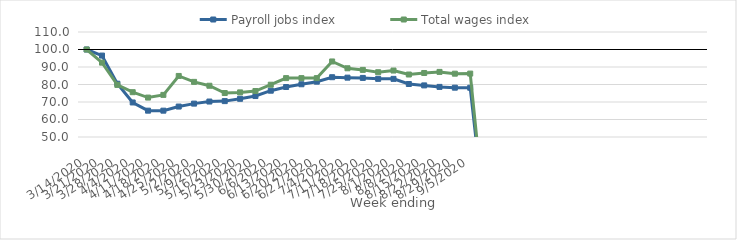
| Category | Payroll jobs index | Total wages index |
|---|---|---|
| 14/03/2020 | 100 | 100 |
| 21/03/2020 | 96.53 | 92.487 |
| 28/03/2020 | 80.452 | 79.766 |
| 04/04/2020 | 69.733 | 75.614 |
| 11/04/2020 | 65.047 | 72.531 |
| 18/04/2020 | 65.046 | 74.069 |
| 25/04/2020 | 67.4 | 84.884 |
| 02/05/2020 | 69.078 | 81.508 |
| 09/05/2020 | 70.267 | 79.287 |
| 16/05/2020 | 70.504 | 75.132 |
| 23/05/2020 | 71.823 | 75.489 |
| 30/05/2020 | 73.406 | 76.271 |
| 06/06/2020 | 76.462 | 79.879 |
| 13/06/2020 | 78.568 | 83.648 |
| 20/06/2020 | 80.14 | 83.649 |
| 27/06/2020 | 81.62 | 83.648 |
| 04/07/2020 | 84.161 | 93.168 |
| 11/07/2020 | 83.916 | 89.275 |
| 18/07/2020 | 83.766 | 88.35 |
| 25/07/2020 | 83.228 | 87.014 |
| 01/08/2020 | 83.223 | 87.976 |
| 08/08/2020 | 80.28 | 85.711 |
| 15/08/2020 | 79.484 | 86.573 |
| 22/08/2020 | 78.634 | 87.202 |
| 29/08/2020 | 78.184 | 86.185 |
| 05/09/2020 | 78.145 | 86.227 |